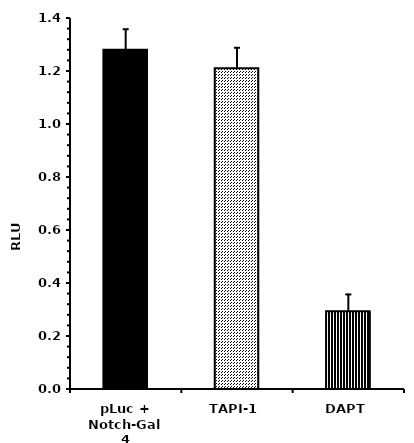
| Category | Series 0 |
|---|---|
| pLuc + Notch-Gal4 | 1.28 |
| TAPI-1 | 1.21 |
| DAPT | 0.293 |